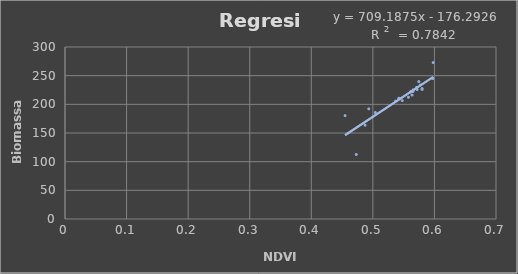
| Category | Series 0 |
|---|---|
| 0.47302 | 112.499 |
| 0.48739 | 163.619 |
| 0.563658 | 216.085 |
| 0.536913 | 205.569 |
| 0.504074 | 185.764 |
| 0.542447 | 210.346 |
| 0.571961 | 225.793 |
| 0.557791 | 212.393 |
| 0.542447 | 210.637 |
| 0.597897 | 272.809 |
| 0.579935 | 227.511 |
| 0.547741 | 206.464 |
| 0.577416 | 233.917 |
| 0.574581 | 239.698 |
| 0.579935 | 225.942 |
| 0.561935 | 222.435 |
| 0.560685 | 221.016 |
| 0.565218 | 222.437 |
| 0.454926 | 180.305 |
| 0.563964 | 222.701 |
| 0.571207 | 229.634 |
| 0.493365 | 192.179 |
| 0.597247 | 245.017 |
| 0.565467 | 225.075 |